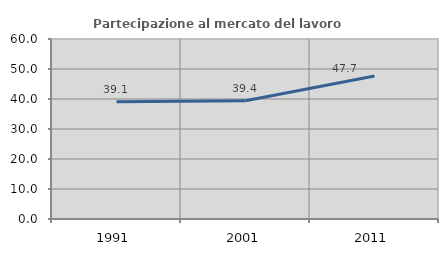
| Category | Partecipazione al mercato del lavoro  femminile |
|---|---|
| 1991.0 | 39.076 |
| 2001.0 | 39.4 |
| 2011.0 | 47.696 |